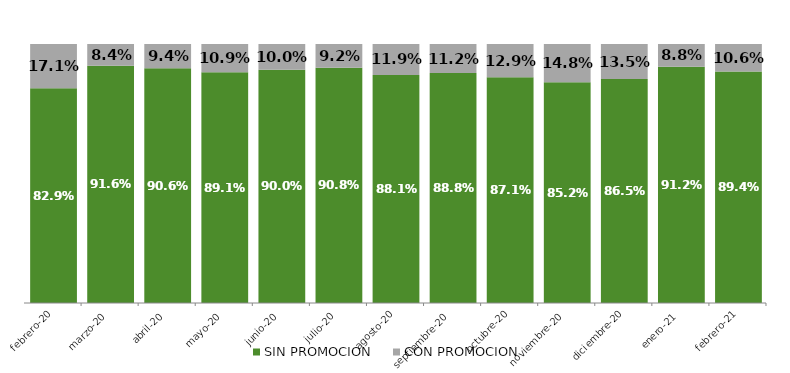
| Category | SIN PROMOCION   | CON PROMOCION   |
|---|---|---|
| 2020-02-01 | 0.829 | 0.171 |
| 2020-03-01 | 0.916 | 0.084 |
| 2020-04-01 | 0.906 | 0.094 |
| 2020-05-01 | 0.891 | 0.109 |
| 2020-06-01 | 0.9 | 0.1 |
| 2020-07-01 | 0.908 | 0.092 |
| 2020-08-01 | 0.881 | 0.119 |
| 2020-09-01 | 0.888 | 0.112 |
| 2020-10-01 | 0.871 | 0.129 |
| 2020-11-01 | 0.852 | 0.148 |
| 2020-12-01 | 0.865 | 0.135 |
| 2021-01-01 | 0.912 | 0.088 |
| 2021-02-01 | 0.894 | 0.106 |